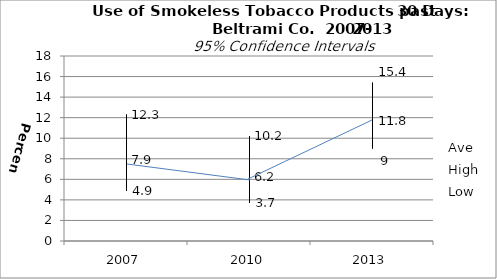
| Category | Ave | High | Low |
|---|---|---|---|
| 2007.0 | 7.9 | 12.3 | 4.9 |
| 2010.0 | 6.2 | 10.2 | 3.7 |
| 2013.0 | 11.8 | 15.4 | 9 |